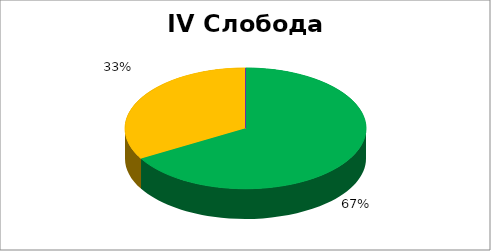
| Category | IV Слобода вероисповести |
|---|---|
| 0 | 0.667 |
| 1 | 0.333 |
| 2 | 0 |
| 3 | 0 |
| 4 | 0 |